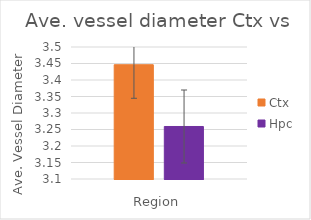
| Category | Ctx | Hpc |
|---|---|---|
| Total cells | 3.446 | 3.259 |